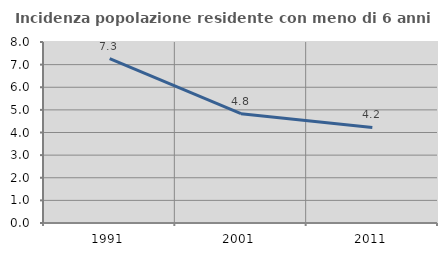
| Category | Incidenza popolazione residente con meno di 6 anni |
|---|---|
| 1991.0 | 7.261 |
| 2001.0 | 4.833 |
| 2011.0 | 4.222 |